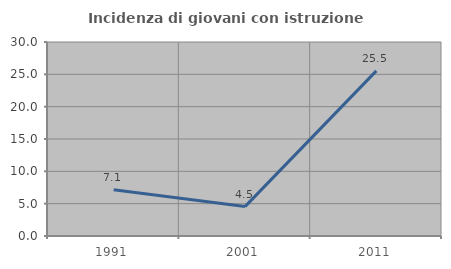
| Category | Incidenza di giovani con istruzione universitaria |
|---|---|
| 1991.0 | 7.143 |
| 2001.0 | 4.545 |
| 2011.0 | 25.532 |